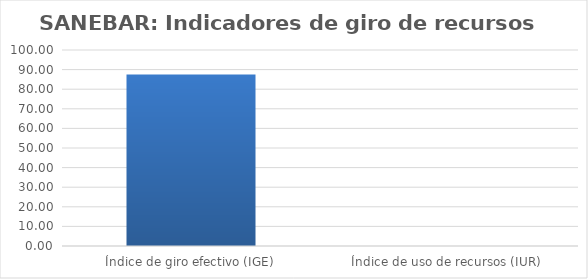
| Category | Series 0 |
|---|---|
| Índice de giro efectivo (IGE) | 87.5 |
| Índice de uso de recursos (IUR)  | 0 |